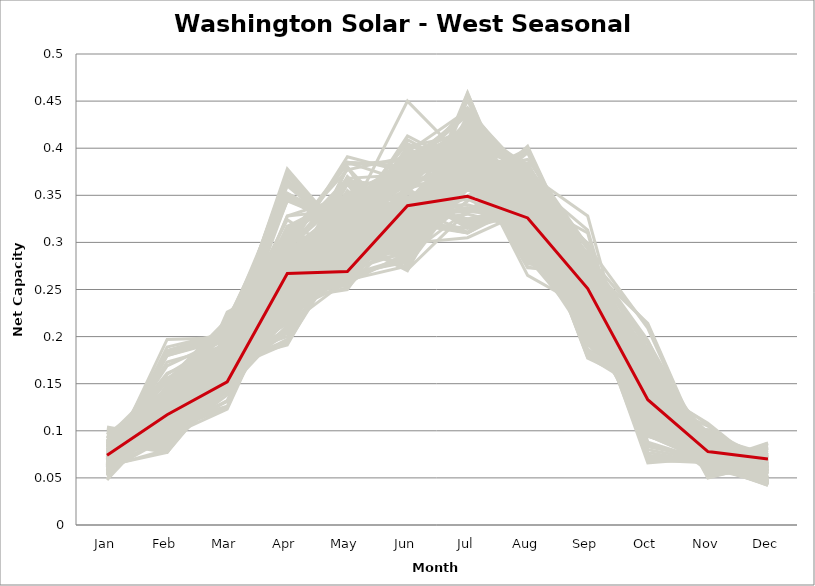
| Category | sample_001 | sample_002 | sample_003 | sample_004 | sample_005 | sample_006 | sample_007 | sample_008 | sample_009 | sample_010 | sample_011 | sample_012 | sample_013 | sample_014 | sample_015 | sample_016 | sample_017 | sample_018 | sample_019 | sample_020 | sample_021 | sample_022 | sample_023 | sample_024 | sample_025 | sample_026 | sample_027 | sample_028 | sample_029 | sample_030 | sample_031 | sample_032 | sample_033 | sample_034 | sample_035 | sample_036 | sample_037 | sample_038 | sample_039 | sample_040 | sample_041 | sample_042 | sample_043 | sample_044 | sample_045 | sample_046 | sample_047 | sample_048 | sample_049 | sample_050 | sample_051 | sample_052 | sample_053 | sample_054 | sample_055 | sample_056 | sample_057 | sample_058 | sample_059 | sample_060 | sample_061 | sample_062 | sample_063 | sample_064 | sample_065 | sample_066 | sample_067 | sample_068 | sample_069 | sample_070 | sample_071 | sample_072 | sample_073 | sample_074 | sample_075 | sample_076 | sample_077 | sample_078 | sample_079 | sample_080 | sample_081 | sample_082 | sample_083 | sample_084 | sample_085 | sample_086 | sample_087 | sample_088 | sample_089 | sample_090 | sample_091 | sample_092 | sample_093 | sample_094 | sample_095 | sample_096 | sample_097 | sample_098 | sample_099 | sample_100 | sample_101 | sample_102 | sample_103 | sample_104 | sample_105 | sample_106 | sample_107 | sample_108 | sample_109 | sample_110 | sample_111 | sample_112 | sample_113 | sample_114 | sample_115 | sample_116 | sample_117 | sample_118 | sample_119 | sample_120 | sample_121 | sample_122 | sample_123 | sample_124 | sample_125 | sample_126 | sample_127 | sample_128 | sample_129 | sample_130 | sample_131 | sample_132 | sample_133 | sample_134 | sample_135 | sample_136 | sample_137 | sample_138 | sample_139 | sample_140 | sample_141 | sample_142 | sample_143 | sample_144 | sample_145 | sample_146 | sample_147 | sample_148 | sample_149 | sample_150 | sample_151 | sample_152 | sample_153 | sample_154 | sample_155 | sample_156 | sample_157 | sample_158 | sample_159 | sample_160 | sample_161 | sample_162 | sample_163 | sample_164 | sample_165 | sample_166 | sample_167 | sample_168 | sample_169 | sample_170 | sample_171 | sample_172 | sample_173 | sample_174 | sample_175 | sample_176 | sample_178 | sample_179 | sample_180 | sample_181 | sample_182 | sample_183 | sample_184 | sample_185 | sample_186 | sample_187 | sample_188 | sample_189 | sample_190 | sample_191 | sample_192 | sample_193 | sample_194 | sample_195 | sample_196 | sample_197 | sample_198 | sample_199 | sample_200 | sample_201 | sample_202 | sample_203 | sample_204 | sample_205 | sample_206 | sample_207 | sample_208 | sample_209 | sample_210 | sample_211 | sample_212 | sample_213 | sample_214 | sample_215 | sample_216 | sample_217 | sample_218 | sample_219 | sample_220 | sample_221 | sample_222 | sample_223 | sample_224 | sample_225 | sample_226 | sample_227 | sample_228 | sample_229 | sample_230 | sample_231 | sample_232 | sample_233 | sample_234 | sample_235 | sample_236 | sample_237 | sample_238 | sample_239 | sample_240 | sample_241 | sample_242 | sample_243 | sample_244 | sample_245 | sample_246 | sample_247 | sample_248 | sample_249 | sample_250 | sample_177 |
|---|---|---|---|---|---|---|---|---|---|---|---|---|---|---|---|---|---|---|---|---|---|---|---|---|---|---|---|---|---|---|---|---|---|---|---|---|---|---|---|---|---|---|---|---|---|---|---|---|---|---|---|---|---|---|---|---|---|---|---|---|---|---|---|---|---|---|---|---|---|---|---|---|---|---|---|---|---|---|---|---|---|---|---|---|---|---|---|---|---|---|---|---|---|---|---|---|---|---|---|---|---|---|---|---|---|---|---|---|---|---|---|---|---|---|---|---|---|---|---|---|---|---|---|---|---|---|---|---|---|---|---|---|---|---|---|---|---|---|---|---|---|---|---|---|---|---|---|---|---|---|---|---|---|---|---|---|---|---|---|---|---|---|---|---|---|---|---|---|---|---|---|---|---|---|---|---|---|---|---|---|---|---|---|---|---|---|---|---|---|---|---|---|---|---|---|---|---|---|---|---|---|---|---|---|---|---|---|---|---|---|---|---|---|---|---|---|---|---|---|---|---|---|---|---|---|---|---|---|---|---|---|---|---|---|---|---|---|---|---|---|---|---|---|---|---|---|---|---|---|---|
| Jan | 0.084 | 0.064 | 0.059 | 0.086 | 0.084 | 0.075 | 0.063 | 0.098 | 0.076 | 0.084 | 0.057 | 0.064 | 0.085 | 0.058 | 0.091 | 0.075 | 0.087 | 0.092 | 0.091 | 0.055 | 0.06 | 0.066 | 0.075 | 0.074 | 0.074 | 0.07 | 0.071 | 0.074 | 0.076 | 0.054 | 0.066 | 0.064 | 0.073 | 0.074 | 0.067 | 0.062 | 0.068 | 0.08 | 0.075 | 0.104 | 0.073 | 0.077 | 0.086 | 0.063 | 0.053 | 0.064 | 0.092 | 0.102 | 0.087 | 0.07 | 0.068 | 0.064 | 0.083 | 0.084 | 0.072 | 0.099 | 0.098 | 0.054 | 0.074 | 0.061 | 0.082 | 0.07 | 0.067 | 0.049 | 0.085 | 0.069 | 0.079 | 0.063 | 0.072 | 0.084 | 0.076 | 0.084 | 0.072 | 0.086 | 0.067 | 0.055 | 0.089 | 0.075 | 0.076 | 0.065 | 0.082 | 0.074 | 0.083 | 0.1 | 0.083 | 0.076 | 0.09 | 0.086 | 0.077 | 0.065 | 0.072 | 0.064 | 0.07 | 0.065 | 0.081 | 0.048 | 0.086 | 0.092 | 0.087 | 0.064 | 0.083 | 0.061 | 0.053 | 0.062 | 0.073 | 0.068 | 0.062 | 0.068 | 0.067 | 0.099 | 0.078 | 0.089 | 0.095 | 0.103 | 0.087 | 0.065 | 0.061 | 0.07 | 0.063 | 0.068 | 0.054 | 0.065 | 0.061 | 0.065 | 0.069 | 0.068 | 0.079 | 0.065 | 0.076 | 0.077 | 0.094 | 0.088 | 0.063 | 0.081 | 0.076 | 0.057 | 0.063 | 0.062 | 0.071 | 0.08 | 0.067 | 0.075 | 0.071 | 0.098 | 0.082 | 0.072 | 0.075 | 0.075 | 0.057 | 0.069 | 0.074 | 0.061 | 0.055 | 0.074 | 0.083 | 0.06 | 0.083 | 0.077 | 0.072 | 0.073 | 0.07 | 0.102 | 0.084 | 0.08 | 0.08 | 0.075 | 0.083 | 0.074 | 0.078 | 0.085 | 0.089 | 0.063 | 0.061 | 0.073 | 0.068 | 0.093 | 0.056 | 0.064 | 0.067 | 0.068 | 0.071 | 0.067 | 0.07 | 0.084 | 0.07 | 0.075 | 0.089 | 0.073 | 0.087 | 0.086 | 0.087 | 0.052 | 0.063 | 0.073 | 0.068 | 0.065 | 0.068 | 0.069 | 0.083 | 0.07 | 0.083 | 0.082 | 0.072 | 0.062 | 0.075 | 0.073 | 0.082 | 0.079 | 0.079 | 0.088 | 0.068 | 0.09 | 0.064 | 0.075 | 0.078 | 0.068 | 0.082 | 0.07 | 0.085 | 0.057 | 0.08 | 0.069 | 0.073 | 0.08 | 0.082 | 0.068 | 0.08 | 0.083 | 0.087 | 0.058 | 0.088 | 0.085 | 0.048 | 0.067 | 0.084 | 0.072 | 0.083 | 0.069 | 0.093 | 0.101 | 0.071 | 0.064 | 0.066 | 0.096 | 0.064 | 0.08 | 0.071 | 0.067 | 0.053 | 0.074 |
| Feb | 0.125 | 0.133 | 0.137 | 0.122 | 0.116 | 0.113 | 0.114 | 0.093 | 0.086 | 0.113 | 0.118 | 0.112 | 0.114 | 0.149 | 0.087 | 0.134 | 0.077 | 0.139 | 0.09 | 0.127 | 0.112 | 0.114 | 0.14 | 0.104 | 0.107 | 0.147 | 0.11 | 0.109 | 0.14 | 0.125 | 0.106 | 0.104 | 0.114 | 0.112 | 0.13 | 0.11 | 0.122 | 0.132 | 0.138 | 0.092 | 0.122 | 0.109 | 0.12 | 0.185 | 0.133 | 0.111 | 0.082 | 0.086 | 0.146 | 0.111 | 0.113 | 0.109 | 0.098 | 0.109 | 0.173 | 0.086 | 0.081 | 0.115 | 0.104 | 0.093 | 0.156 | 0.184 | 0.116 | 0.125 | 0.081 | 0.116 | 0.095 | 0.182 | 0.185 | 0.112 | 0.117 | 0.1 | 0.117 | 0.155 | 0.109 | 0.126 | 0.136 | 0.111 | 0.089 | 0.102 | 0.093 | 0.105 | 0.126 | 0.084 | 0.101 | 0.103 | 0.128 | 0.121 | 0.098 | 0.121 | 0.105 | 0.113 | 0.123 | 0.123 | 0.107 | 0.116 | 0.09 | 0.144 | 0.119 | 0.121 | 0.103 | 0.116 | 0.134 | 0.119 | 0.105 | 0.108 | 0.121 | 0.128 | 0.125 | 0.088 | 0.095 | 0.091 | 0.094 | 0.085 | 0.133 | 0.108 | 0.102 | 0.108 | 0.11 | 0.112 | 0.127 | 0.134 | 0.189 | 0.125 | 0.119 | 0.125 | 0.121 | 0.117 | 0.124 | 0.107 | 0.086 | 0.143 | 0.108 | 0.099 | 0.117 | 0.093 | 0.119 | 0.08 | 0.099 | 0.118 | 0.131 | 0.134 | 0.122 | 0.078 | 0.117 | 0.112 | 0.123 | 0.1 | 0.144 | 0.101 | 0.132 | 0.119 | 0.142 | 0.16 | 0.097 | 0.121 | 0.123 | 0.116 | 0.121 | 0.126 | 0.18 | 0.093 | 0.117 | 0.122 | 0.102 | 0.132 | 0.105 | 0.136 | 0.123 | 0.091 | 0.153 | 0.118 | 0.105 | 0.11 | 0.092 | 0.156 | 0.129 | 0.11 | 0.118 | 0.122 | 0.108 | 0.127 | 0.103 | 0.132 | 0.108 | 0.112 | 0.129 | 0.126 | 0.103 | 0.082 | 0.08 | 0.117 | 0.077 | 0.169 | 0.123 | 0.181 | 0.128 | 0.098 | 0.117 | 0.102 | 0.161 | 0.103 | 0.111 | 0.197 | 0.122 | 0.1 | 0.143 | 0.094 | 0.09 | 0.129 | 0.13 | 0.086 | 0.111 | 0.117 | 0.153 | 0.099 | 0.152 | 0.116 | 0.088 | 0.146 | 0.133 | 0.185 | 0.127 | 0.129 | 0.117 | 0.109 | 0.112 | 0.112 | 0.088 | 0.131 | 0.128 | 0.134 | 0.129 | 0.102 | 0.08 | 0.117 | 0.115 | 0.104 | 0.089 | 0.087 | 0.109 | 0.18 | 0.119 | 0.144 | 0.119 | 0.095 | 0.115 | 0.128 | 0.126 | 0.117 |
| Mar | 0.17 | 0.216 | 0.198 | 0.189 | 0.174 | 0.155 | 0.175 | 0.152 | 0.144 | 0.165 | 0.185 | 0.182 | 0.183 | 0.217 | 0.15 | 0.195 | 0.153 | 0.196 | 0.146 | 0.172 | 0.189 | 0.174 | 0.189 | 0.131 | 0.126 | 0.195 | 0.16 | 0.141 | 0.184 | 0.191 | 0.179 | 0.176 | 0.197 | 0.174 | 0.217 | 0.182 | 0.189 | 0.183 | 0.211 | 0.188 | 0.153 | 0.143 | 0.182 | 0.205 | 0.194 | 0.171 | 0.143 | 0.174 | 0.161 | 0.197 | 0.177 | 0.178 | 0.175 | 0.171 | 0.191 | 0.175 | 0.18 | 0.173 | 0.142 | 0.161 | 0.193 | 0.2 | 0.187 | 0.153 | 0.226 | 0.163 | 0.165 | 0.206 | 0.202 | 0.175 | 0.18 | 0.222 | 0.147 | 0.158 | 0.182 | 0.191 | 0.154 | 0.144 | 0.151 | 0.174 | 0.132 | 0.149 | 0.194 | 0.153 | 0.173 | 0.143 | 0.153 | 0.19 | 0.173 | 0.163 | 0.155 | 0.184 | 0.187 | 0.187 | 0.164 | 0.16 | 0.138 | 0.153 | 0.172 | 0.197 | 0.174 | 0.173 | 0.189 | 0.161 | 0.158 | 0.156 | 0.16 | 0.214 | 0.191 | 0.174 | 0.2 | 0.149 | 0.175 | 0.159 | 0.192 | 0.186 | 0.159 | 0.151 | 0.156 | 0.172 | 0.194 | 0.198 | 0.204 | 0.214 | 0.189 | 0.19 | 0.145 | 0.192 | 0.175 | 0.183 | 0.15 | 0.151 | 0.159 | 0.125 | 0.155 | 0.148 | 0.174 | 0.155 | 0.18 | 0.185 | 0.212 | 0.209 | 0.149 | 0.154 | 0.18 | 0.178 | 0.156 | 0.18 | 0.208 | 0.178 | 0.191 | 0.175 | 0.195 | 0.199 | 0.132 | 0.169 | 0.192 | 0.142 | 0.153 | 0.151 | 0.197 | 0.186 | 0.176 | 0.172 | 0.168 | 0.186 | 0.171 | 0.19 | 0.182 | 0.148 | 0.155 | 0.191 | 0.185 | 0.171 | 0.18 | 0.165 | 0.19 | 0.185 | 0.193 | 0.186 | 0.177 | 0.214 | 0.168 | 0.19 | 0.151 | 0.175 | 0.192 | 0.152 | 0.178 | 0.144 | 0.166 | 0.172 | 0.163 | 0.199 | 0.186 | 0.198 | 0.194 | 0.173 | 0.175 | 0.172 | 0.189 | 0.165 | 0.153 | 0.199 | 0.14 | 0.178 | 0.19 | 0.123 | 0.15 | 0.191 | 0.211 | 0.183 | 0.189 | 0.148 | 0.218 | 0.169 | 0.19 | 0.175 | 0.2 | 0.211 | 0.174 | 0.194 | 0.145 | 0.167 | 0.154 | 0.162 | 0.151 | 0.179 | 0.192 | 0.158 | 0.163 | 0.157 | 0.158 | 0.152 | 0.149 | 0.153 | 0.172 | 0.172 | 0.161 | 0.159 | 0.176 | 0.199 | 0.154 | 0.166 | 0.162 | 0.142 | 0.148 | 0.21 | 0.193 | 0.152 |
| Apr | 0.283 | 0.352 | 0.272 | 0.3 | 0.245 | 0.264 | 0.224 | 0.254 | 0.212 | 0.197 | 0.246 | 0.225 | 0.317 | 0.282 | 0.262 | 0.232 | 0.248 | 0.29 | 0.252 | 0.251 | 0.348 | 0.214 | 0.245 | 0.258 | 0.258 | 0.269 | 0.232 | 0.227 | 0.234 | 0.251 | 0.328 | 0.233 | 0.245 | 0.289 | 0.345 | 0.226 | 0.226 | 0.235 | 0.236 | 0.243 | 0.227 | 0.246 | 0.306 | 0.309 | 0.276 | 0.215 | 0.255 | 0.246 | 0.231 | 0.374 | 0.215 | 0.218 | 0.236 | 0.238 | 0.296 | 0.25 | 0.25 | 0.24 | 0.238 | 0.227 | 0.27 | 0.285 | 0.216 | 0.228 | 0.259 | 0.257 | 0.193 | 0.314 | 0.284 | 0.233 | 0.298 | 0.303 | 0.228 | 0.231 | 0.37 | 0.266 | 0.223 | 0.252 | 0.228 | 0.314 | 0.255 | 0.234 | 0.292 | 0.256 | 0.244 | 0.241 | 0.211 | 0.294 | 0.283 | 0.246 | 0.221 | 0.223 | 0.238 | 0.222 | 0.245 | 0.237 | 0.239 | 0.236 | 0.252 | 0.373 | 0.191 | 0.251 | 0.258 | 0.24 | 0.222 | 0.22 | 0.204 | 0.352 | 0.241 | 0.247 | 0.243 | 0.256 | 0.253 | 0.252 | 0.303 | 0.347 | 0.226 | 0.22 | 0.237 | 0.262 | 0.25 | 0.36 | 0.31 | 0.346 | 0.23 | 0.23 | 0.259 | 0.378 | 0.293 | 0.283 | 0.256 | 0.228 | 0.26 | 0.265 | 0.235 | 0.277 | 0.215 | 0.217 | 0.299 | 0.283 | 0.345 | 0.235 | 0.232 | 0.249 | 0.312 | 0.236 | 0.247 | 0.266 | 0.281 | 0.2 | 0.234 | 0.229 | 0.289 | 0.261 | 0.239 | 0.259 | 0.293 | 0.244 | 0.249 | 0.282 | 0.286 | 0.239 | 0.317 | 0.243 | 0.245 | 0.239 | 0.246 | 0.226 | 0.227 | 0.238 | 0.231 | 0.366 | 0.348 | 0.24 | 0.291 | 0.247 | 0.278 | 0.363 | 0.374 | 0.223 | 0.351 | 0.349 | 0.261 | 0.285 | 0.228 | 0.247 | 0.302 | 0.239 | 0.238 | 0.244 | 0.251 | 0.251 | 0.206 | 0.298 | 0.215 | 0.294 | 0.236 | 0.195 | 0.27 | 0.345 | 0.266 | 0.243 | 0.265 | 0.324 | 0.252 | 0.272 | 0.297 | 0.262 | 0.226 | 0.307 | 0.363 | 0.246 | 0.344 | 0.234 | 0.241 | 0.23 | 0.269 | 0.207 | 0.236 | 0.281 | 0.24 | 0.285 | 0.23 | 0.241 | 0.248 | 0.26 | 0.264 | 0.247 | 0.244 | 0.255 | 0.209 | 0.221 | 0.239 | 0.22 | 0.247 | 0.231 | 0.236 | 0.328 | 0.264 | 0.255 | 0.274 | 0.305 | 0.241 | 0.251 | 0.206 | 0.244 | 0.23 | 0.346 | 0.251 | 0.267 |
| May | 0.267 | 0.316 | 0.317 | 0.368 | 0.257 | 0.276 | 0.283 | 0.37 | 0.26 | 0.302 | 0.333 | 0.282 | 0.349 | 0.314 | 0.35 | 0.294 | 0.316 | 0.391 | 0.347 | 0.321 | 0.307 | 0.295 | 0.297 | 0.326 | 0.328 | 0.297 | 0.281 | 0.263 | 0.293 | 0.328 | 0.349 | 0.333 | 0.299 | 0.341 | 0.318 | 0.287 | 0.297 | 0.305 | 0.288 | 0.365 | 0.278 | 0.277 | 0.364 | 0.295 | 0.313 | 0.297 | 0.347 | 0.38 | 0.297 | 0.298 | 0.292 | 0.294 | 0.329 | 0.26 | 0.29 | 0.366 | 0.38 | 0.334 | 0.27 | 0.305 | 0.322 | 0.297 | 0.288 | 0.351 | 0.283 | 0.336 | 0.294 | 0.285 | 0.295 | 0.263 | 0.352 | 0.258 | 0.284 | 0.315 | 0.302 | 0.331 | 0.283 | 0.269 | 0.267 | 0.345 | 0.324 | 0.278 | 0.366 | 0.366 | 0.33 | 0.265 | 0.299 | 0.385 | 0.326 | 0.331 | 0.282 | 0.282 | 0.29 | 0.295 | 0.258 | 0.34 | 0.339 | 0.322 | 0.254 | 0.294 | 0.303 | 0.319 | 0.322 | 0.327 | 0.27 | 0.269 | 0.312 | 0.319 | 0.319 | 0.364 | 0.299 | 0.355 | 0.362 | 0.379 | 0.383 | 0.326 | 0.313 | 0.275 | 0.332 | 0.334 | 0.328 | 0.307 | 0.28 | 0.314 | 0.292 | 0.3 | 0.279 | 0.304 | 0.35 | 0.335 | 0.342 | 0.301 | 0.327 | 0.323 | 0.279 | 0.312 | 0.291 | 0.33 | 0.35 | 0.337 | 0.322 | 0.285 | 0.278 | 0.362 | 0.344 | 0.336 | 0.275 | 0.341 | 0.297 | 0.302 | 0.304 | 0.284 | 0.316 | 0.3 | 0.329 | 0.32 | 0.324 | 0.279 | 0.281 | 0.291 | 0.294 | 0.367 | 0.339 | 0.259 | 0.339 | 0.307 | 0.341 | 0.308 | 0.308 | 0.343 | 0.314 | 0.302 | 0.312 | 0.336 | 0.338 | 0.324 | 0.316 | 0.302 | 0.306 | 0.296 | 0.321 | 0.324 | 0.338 | 0.337 | 0.27 | 0.334 | 0.385 | 0.284 | 0.329 | 0.327 | 0.307 | 0.328 | 0.324 | 0.291 | 0.29 | 0.287 | 0.293 | 0.302 | 0.305 | 0.326 | 0.321 | 0.336 | 0.28 | 0.281 | 0.276 | 0.336 | 0.385 | 0.323 | 0.257 | 0.377 | 0.318 | 0.303 | 0.318 | 0.274 | 0.292 | 0.328 | 0.332 | 0.306 | 0.296 | 0.316 | 0.25 | 0.29 | 0.283 | 0.255 | 0.272 | 0.328 | 0.268 | 0.262 | 0.302 | 0.313 | 0.305 | 0.292 | 0.348 | 0.267 | 0.312 | 0.275 | 0.252 | 0.335 | 0.369 | 0.368 | 0.332 | 0.283 | 0.34 | 0.332 | 0.311 | 0.342 | 0.266 | 0.316 | 0.329 | 0.269 |
| Jun | 0.34 | 0.391 | 0.396 | 0.372 | 0.329 | 0.321 | 0.307 | 0.306 | 0.275 | 0.372 | 0.362 | 0.294 | 0.373 | 0.401 | 0.29 | 0.314 | 0.297 | 0.374 | 0.303 | 0.367 | 0.37 | 0.296 | 0.337 | 0.309 | 0.321 | 0.285 | 0.357 | 0.282 | 0.329 | 0.387 | 0.332 | 0.277 | 0.335 | 0.391 | 0.382 | 0.299 | 0.327 | 0.328 | 0.312 | 0.338 | 0.354 | 0.309 | 0.361 | 0.299 | 0.394 | 0.308 | 0.292 | 0.311 | 0.396 | 0.393 | 0.29 | 0.319 | 0.291 | 0.319 | 0.278 | 0.314 | 0.285 | 0.308 | 0.29 | 0.271 | 0.361 | 0.305 | 0.321 | 0.299 | 0.33 | 0.387 | 0.36 | 0.299 | 0.293 | 0.327 | 0.381 | 0.364 | 0.352 | 0.375 | 0.376 | 0.384 | 0.38 | 0.307 | 0.279 | 0.332 | 0.317 | 0.299 | 0.357 | 0.299 | 0.292 | 0.284 | 0.376 | 0.364 | 0.37 | 0.284 | 0.322 | 0.3 | 0.318 | 0.322 | 0.325 | 0.298 | 0.306 | 0.375 | 0.337 | 0.395 | 0.375 | 0.39 | 0.388 | 0.278 | 0.32 | 0.348 | 0.288 | 0.391 | 0.327 | 0.29 | 0.292 | 0.299 | 0.318 | 0.306 | 0.387 | 0.375 | 0.286 | 0.338 | 0.275 | 0.391 | 0.395 | 0.393 | 0.287 | 0.393 | 0.31 | 0.317 | 0.325 | 0.395 | 0.384 | 0.37 | 0.289 | 0.382 | 0.372 | 0.303 | 0.354 | 0.386 | 0.318 | 0.405 | 0.333 | 0.344 | 0.387 | 0.295 | 0.335 | 0.279 | 0.383 | 0.363 | 0.321 | 0.379 | 0.398 | 0.273 | 0.318 | 0.309 | 0.409 | 0.3 | 0.308 | 0.387 | 0.45 | 0.313 | 0.341 | 0.347 | 0.292 | 0.33 | 0.383 | 0.339 | 0.29 | 0.33 | 0.28 | 0.321 | 0.31 | 0.296 | 0.384 | 0.402 | 0.365 | 0.295 | 0.331 | 0.387 | 0.413 | 0.375 | 0.392 | 0.325 | 0.343 | 0.392 | 0.387 | 0.368 | 0.338 | 0.29 | 0.381 | 0.344 | 0.306 | 0.301 | 0.31 | 0.353 | 0.382 | 0.29 | 0.319 | 0.304 | 0.317 | 0.27 | 0.377 | 0.356 | 0.348 | 0.281 | 0.335 | 0.315 | 0.318 | 0.37 | 0.38 | 0.294 | 0.289 | 0.391 | 0.391 | 0.3 | 0.377 | 0.331 | 0.29 | 0.279 | 0.343 | 0.284 | 0.31 | 0.389 | 0.341 | 0.299 | 0.328 | 0.337 | 0.335 | 0.395 | 0.338 | 0.335 | 0.304 | 0.381 | 0.38 | 0.373 | 0.317 | 0.323 | 0.293 | 0.33 | 0.318 | 0.336 | 0.305 | 0.3 | 0.393 | 0.291 | 0.282 | 0.38 | 0.292 | 0.321 | 0.299 | 0.375 | 0.383 | 0.339 |
| Jul | 0.359 | 0.393 | 0.38 | 0.381 | 0.384 | 0.33 | 0.411 | 0.375 | 0.415 | 0.424 | 0.379 | 0.394 | 0.401 | 0.398 | 0.368 | 0.418 | 0.426 | 0.391 | 0.388 | 0.4 | 0.412 | 0.41 | 0.421 | 0.367 | 0.366 | 0.367 | 0.32 | 0.4 | 0.408 | 0.373 | 0.411 | 0.36 | 0.38 | 0.413 | 0.405 | 0.394 | 0.411 | 0.414 | 0.349 | 0.373 | 0.315 | 0.391 | 0.39 | 0.424 | 0.373 | 0.416 | 0.382 | 0.382 | 0.44 | 0.413 | 0.403 | 0.41 | 0.381 | 0.367 | 0.408 | 0.377 | 0.381 | 0.414 | 0.399 | 0.333 | 0.365 | 0.398 | 0.406 | 0.424 | 0.428 | 0.392 | 0.429 | 0.425 | 0.398 | 0.369 | 0.407 | 0.42 | 0.321 | 0.44 | 0.405 | 0.376 | 0.44 | 0.372 | 0.418 | 0.406 | 0.361 | 0.412 | 0.375 | 0.381 | 0.384 | 0.407 | 0.425 | 0.382 | 0.405 | 0.378 | 0.315 | 0.409 | 0.407 | 0.418 | 0.36 | 0.416 | 0.375 | 0.442 | 0.39 | 0.407 | 0.422 | 0.406 | 0.393 | 0.365 | 0.31 | 0.318 | 0.4 | 0.399 | 0.389 | 0.374 | 0.458 | 0.375 | 0.368 | 0.387 | 0.384 | 0.412 | 0.334 | 0.311 | 0.36 | 0.402 | 0.379 | 0.421 | 0.423 | 0.403 | 0.399 | 0.422 | 0.381 | 0.408 | 0.412 | 0.405 | 0.372 | 0.437 | 0.406 | 0.369 | 0.316 | 0.402 | 0.407 | 0.375 | 0.399 | 0.4 | 0.406 | 0.344 | 0.325 | 0.376 | 0.396 | 0.359 | 0.337 | 0.409 | 0.38 | 0.384 | 0.42 | 0.415 | 0.375 | 0.362 | 0.365 | 0.405 | 0.385 | 0.391 | 0.333 | 0.323 | 0.407 | 0.365 | 0.392 | 0.382 | 0.387 | 0.418 | 0.386 | 0.421 | 0.415 | 0.365 | 0.438 | 0.415 | 0.411 | 0.38 | 0.392 | 0.435 | 0.38 | 0.407 | 0.414 | 0.417 | 0.413 | 0.398 | 0.393 | 0.396 | 0.325 | 0.383 | 0.386 | 0.336 | 0.387 | 0.413 | 0.43 | 0.412 | 0.389 | 0.408 | 0.418 | 0.408 | 0.421 | 0.388 | 0.399 | 0.424 | 0.361 | 0.39 | 0.346 | 0.427 | 0.379 | 0.41 | 0.389 | 0.356 | 0.415 | 0.395 | 0.412 | 0.451 | 0.414 | 0.334 | 0.344 | 0.363 | 0.376 | 0.4 | 0.435 | 0.396 | 0.4 | 0.395 | 0.333 | 0.382 | 0.368 | 0.391 | 0.34 | 0.382 | 0.459 | 0.387 | 0.425 | 0.443 | 0.425 | 0.31 | 0.414 | 0.31 | 0.377 | 0.421 | 0.384 | 0.389 | 0.405 | 0.425 | 0.375 | 0.435 | 0.393 | 0.37 | 0.305 | 0.397 | 0.374 | 0.349 |
| Aug | 0.342 | 0.293 | 0.37 | 0.286 | 0.282 | 0.314 | 0.348 | 0.326 | 0.295 | 0.37 | 0.382 | 0.343 | 0.296 | 0.362 | 0.333 | 0.345 | 0.345 | 0.277 | 0.339 | 0.384 | 0.319 | 0.355 | 0.333 | 0.33 | 0.34 | 0.399 | 0.35 | 0.282 | 0.322 | 0.377 | 0.354 | 0.361 | 0.314 | 0.329 | 0.293 | 0.35 | 0.349 | 0.33 | 0.4 | 0.284 | 0.348 | 0.284 | 0.274 | 0.327 | 0.38 | 0.352 | 0.328 | 0.303 | 0.372 | 0.294 | 0.354 | 0.35 | 0.336 | 0.286 | 0.334 | 0.285 | 0.291 | 0.376 | 0.299 | 0.367 | 0.324 | 0.357 | 0.343 | 0.377 | 0.325 | 0.343 | 0.378 | 0.319 | 0.357 | 0.289 | 0.32 | 0.29 | 0.352 | 0.357 | 0.303 | 0.374 | 0.363 | 0.281 | 0.301 | 0.363 | 0.326 | 0.309 | 0.289 | 0.314 | 0.343 | 0.289 | 0.362 | 0.273 | 0.32 | 0.344 | 0.332 | 0.345 | 0.333 | 0.35 | 0.29 | 0.378 | 0.326 | 0.362 | 0.265 | 0.303 | 0.376 | 0.364 | 0.379 | 0.351 | 0.346 | 0.35 | 0.369 | 0.286 | 0.327 | 0.288 | 0.312 | 0.341 | 0.292 | 0.309 | 0.286 | 0.333 | 0.373 | 0.353 | 0.345 | 0.332 | 0.382 | 0.291 | 0.321 | 0.298 | 0.341 | 0.347 | 0.299 | 0.322 | 0.32 | 0.308 | 0.323 | 0.358 | 0.349 | 0.332 | 0.351 | 0.38 | 0.351 | 0.388 | 0.373 | 0.299 | 0.295 | 0.402 | 0.339 | 0.312 | 0.307 | 0.383 | 0.323 | 0.332 | 0.36 | 0.363 | 0.341 | 0.353 | 0.371 | 0.396 | 0.32 | 0.363 | 0.373 | 0.286 | 0.326 | 0.332 | 0.361 | 0.291 | 0.292 | 0.295 | 0.348 | 0.33 | 0.344 | 0.338 | 0.342 | 0.33 | 0.366 | 0.302 | 0.321 | 0.326 | 0.381 | 0.362 | 0.37 | 0.314 | 0.313 | 0.353 | 0.335 | 0.291 | 0.329 | 0.319 | 0.337 | 0.349 | 0.288 | 0.343 | 0.342 | 0.358 | 0.334 | 0.379 | 0.379 | 0.34 | 0.353 | 0.324 | 0.345 | 0.36 | 0.341 | 0.343 | 0.305 | 0.35 | 0.317 | 0.325 | 0.288 | 0.334 | 0.298 | 0.327 | 0.297 | 0.293 | 0.294 | 0.309 | 0.326 | 0.337 | 0.395 | 0.364 | 0.315 | 0.348 | 0.303 | 0.361 | 0.281 | 0.364 | 0.341 | 0.291 | 0.297 | 0.331 | 0.322 | 0.298 | 0.303 | 0.374 | 0.363 | 0.366 | 0.381 | 0.345 | 0.348 | 0.342 | 0.28 | 0.351 | 0.323 | 0.306 | 0.325 | 0.327 | 0.349 | 0.367 | 0.364 | 0.325 | 0.334 | 0.286 | 0.377 | 0.326 |
| Sep | 0.239 | 0.214 | 0.247 | 0.266 | 0.237 | 0.219 | 0.191 | 0.23 | 0.274 | 0.288 | 0.286 | 0.192 | 0.258 | 0.247 | 0.242 | 0.177 | 0.229 | 0.273 | 0.234 | 0.265 | 0.212 | 0.202 | 0.187 | 0.274 | 0.28 | 0.268 | 0.253 | 0.267 | 0.198 | 0.271 | 0.201 | 0.299 | 0.252 | 0.282 | 0.219 | 0.194 | 0.193 | 0.193 | 0.265 | 0.208 | 0.251 | 0.27 | 0.262 | 0.228 | 0.263 | 0.203 | 0.238 | 0.219 | 0.244 | 0.198 | 0.21 | 0.197 | 0.251 | 0.242 | 0.246 | 0.226 | 0.226 | 0.285 | 0.264 | 0.313 | 0.217 | 0.258 | 0.209 | 0.275 | 0.196 | 0.273 | 0.285 | 0.236 | 0.255 | 0.247 | 0.269 | 0.212 | 0.254 | 0.225 | 0.198 | 0.271 | 0.257 | 0.273 | 0.27 | 0.206 | 0.268 | 0.269 | 0.271 | 0.23 | 0.245 | 0.257 | 0.267 | 0.269 | 0.284 | 0.276 | 0.272 | 0.202 | 0.194 | 0.205 | 0.259 | 0.285 | 0.255 | 0.236 | 0.229 | 0.206 | 0.283 | 0.255 | 0.283 | 0.299 | 0.26 | 0.267 | 0.214 | 0.221 | 0.238 | 0.216 | 0.229 | 0.242 | 0.219 | 0.223 | 0.263 | 0.199 | 0.328 | 0.259 | 0.31 | 0.281 | 0.276 | 0.217 | 0.233 | 0.219 | 0.208 | 0.178 | 0.272 | 0.207 | 0.266 | 0.276 | 0.236 | 0.272 | 0.264 | 0.267 | 0.253 | 0.269 | 0.209 | 0.296 | 0.193 | 0.277 | 0.211 | 0.265 | 0.255 | 0.228 | 0.262 | 0.278 | 0.246 | 0.281 | 0.25 | 0.227 | 0.181 | 0.197 | 0.267 | 0.264 | 0.269 | 0.262 | 0.211 | 0.277 | 0.25 | 0.204 | 0.251 | 0.206 | 0.269 | 0.25 | 0.262 | 0.198 | 0.266 | 0.184 | 0.179 | 0.248 | 0.232 | 0.208 | 0.212 | 0.266 | 0.199 | 0.222 | 0.254 | 0.199 | 0.192 | 0.2 | 0.207 | 0.217 | 0.267 | 0.243 | 0.282 | 0.265 | 0.254 | 0.252 | 0.238 | 0.246 | 0.221 | 0.28 | 0.293 | 0.248 | 0.205 | 0.25 | 0.184 | 0.227 | 0.229 | 0.207 | 0.221 | 0.256 | 0.228 | 0.212 | 0.278 | 0.289 | 0.268 | 0.269 | 0.274 | 0.261 | 0.215 | 0.23 | 0.206 | 0.257 | 0.264 | 0.298 | 0.212 | 0.215 | 0.222 | 0.236 | 0.232 | 0.256 | 0.25 | 0.244 | 0.27 | 0.283 | 0.249 | 0.256 | 0.226 | 0.245 | 0.281 | 0.261 | 0.296 | 0.264 | 0.237 | 0.247 | 0.238 | 0.198 | 0.224 | 0.222 | 0.281 | 0.231 | 0.296 | 0.209 | 0.213 | 0.258 | 0.241 | 0.216 | 0.266 | 0.251 |
| Oct | 0.141 | 0.095 | 0.15 | 0.117 | 0.128 | 0.122 | 0.183 | 0.116 | 0.153 | 0.134 | 0.17 | 0.168 | 0.138 | 0.143 | 0.113 | 0.147 | 0.162 | 0.105 | 0.119 | 0.185 | 0.133 | 0.179 | 0.137 | 0.118 | 0.119 | 0.126 | 0.15 | 0.164 | 0.136 | 0.174 | 0.139 | 0.088 | 0.149 | 0.155 | 0.101 | 0.165 | 0.158 | 0.137 | 0.141 | 0.12 | 0.146 | 0.147 | 0.126 | 0.095 | 0.155 | 0.182 | 0.113 | 0.127 | 0.116 | 0.115 | 0.181 | 0.178 | 0.069 | 0.137 | 0.108 | 0.119 | 0.117 | 0.196 | 0.156 | 0.095 | 0.112 | 0.121 | 0.168 | 0.214 | 0.152 | 0.183 | 0.148 | 0.102 | 0.114 | 0.131 | 0.146 | 0.129 | 0.142 | 0.111 | 0.127 | 0.164 | 0.112 | 0.141 | 0.151 | 0.146 | 0.115 | 0.159 | 0.107 | 0.126 | 0.066 | 0.156 | 0.113 | 0.107 | 0.159 | 0.083 | 0.144 | 0.172 | 0.151 | 0.155 | 0.133 | 0.212 | 0.116 | 0.115 | 0.125 | 0.119 | 0.147 | 0.167 | 0.17 | 0.085 | 0.143 | 0.151 | 0.187 | 0.101 | 0.141 | 0.116 | 0.162 | 0.114 | 0.127 | 0.123 | 0.111 | 0.138 | 0.096 | 0.151 | 0.086 | 0.172 | 0.175 | 0.111 | 0.096 | 0.097 | 0.149 | 0.152 | 0.137 | 0.133 | 0.144 | 0.138 | 0.11 | 0.113 | 0.16 | 0.115 | 0.144 | 0.156 | 0.176 | 0.16 | 0.155 | 0.14 | 0.108 | 0.136 | 0.146 | 0.122 | 0.145 | 0.126 | 0.124 | 0.168 | 0.129 | 0.187 | 0.148 | 0.174 | 0.15 | 0.122 | 0.114 | 0.158 | 0.16 | 0.154 | 0.13 | 0.135 | 0.123 | 0.12 | 0.142 | 0.14 | 0.071 | 0.141 | 0.069 | 0.149 | 0.14 | 0.107 | 0.116 | 0.125 | 0.134 | 0.074 | 0.158 | 0.12 | 0.156 | 0.133 | 0.126 | 0.156 | 0.136 | 0.105 | 0.181 | 0.1 | 0.156 | 0.077 | 0.115 | 0.138 | 0.071 | 0.16 | 0.156 | 0.192 | 0.176 | 0.11 | 0.155 | 0.094 | 0.154 | 0.184 | 0.125 | 0.142 | 0.104 | 0.069 | 0.129 | 0.098 | 0.153 | 0.165 | 0.114 | 0.121 | 0.162 | 0.124 | 0.106 | 0.148 | 0.137 | 0.131 | 0.135 | 0.1 | 0.114 | 0.172 | 0.159 | 0.121 | 0.141 | 0.126 | 0.14 | 0.136 | 0.136 | 0.187 | 0.13 | 0.127 | 0.153 | 0.163 | 0.114 | 0.115 | 0.209 | 0.144 | 0.165 | 0.144 | 0.128 | 0.144 | 0.124 | 0.125 | 0.164 | 0.101 | 0.08 | 0.124 | 0.195 | 0.123 | 0.132 | 0.099 | 0.168 | 0.133 |
| Nov | 0.08 | 0.068 | 0.055 | 0.064 | 0.066 | 0.073 | 0.075 | 0.079 | 0.08 | 0.105 | 0.057 | 0.072 | 0.06 | 0.059 | 0.084 | 0.069 | 0.095 | 0.073 | 0.086 | 0.065 | 0.088 | 0.077 | 0.07 | 0.089 | 0.094 | 0.077 | 0.081 | 0.065 | 0.07 | 0.054 | 0.086 | 0.068 | 0.07 | 0.064 | 0.075 | 0.07 | 0.068 | 0.073 | 0.084 | 0.067 | 0.086 | 0.065 | 0.064 | 0.071 | 0.053 | 0.077 | 0.083 | 0.079 | 0.091 | 0.08 | 0.078 | 0.077 | 0.067 | 0.067 | 0.082 | 0.064 | 0.073 | 0.066 | 0.066 | 0.067 | 0.065 | 0.077 | 0.074 | 0.069 | 0.078 | 0.067 | 0.107 | 0.079 | 0.074 | 0.065 | 0.066 | 0.081 | 0.081 | 0.082 | 0.078 | 0.051 | 0.095 | 0.064 | 0.083 | 0.089 | 0.085 | 0.076 | 0.069 | 0.08 | 0.071 | 0.068 | 0.095 | 0.067 | 0.064 | 0.07 | 0.094 | 0.073 | 0.064 | 0.074 | 0.069 | 0.068 | 0.09 | 0.085 | 0.063 | 0.08 | 0.108 | 0.07 | 0.066 | 0.069 | 0.086 | 0.087 | 0.082 | 0.074 | 0.069 | 0.07 | 0.074 | 0.084 | 0.069 | 0.078 | 0.072 | 0.081 | 0.069 | 0.09 | 0.066 | 0.067 | 0.054 | 0.081 | 0.072 | 0.069 | 0.075 | 0.069 | 0.062 | 0.078 | 0.066 | 0.064 | 0.082 | 0.095 | 0.072 | 0.093 | 0.082 | 0.085 | 0.077 | 0.098 | 0.092 | 0.06 | 0.075 | 0.082 | 0.083 | 0.074 | 0.062 | 0.096 | 0.078 | 0.066 | 0.056 | 0.078 | 0.073 | 0.073 | 0.055 | 0.076 | 0.084 | 0.069 | 0.082 | 0.062 | 0.077 | 0.074 | 0.074 | 0.068 | 0.061 | 0.065 | 0.071 | 0.067 | 0.066 | 0.069 | 0.073 | 0.082 | 0.092 | 0.082 | 0.083 | 0.067 | 0.091 | 0.078 | 0.055 | 0.079 | 0.08 | 0.075 | 0.08 | 0.075 | 0.067 | 0.101 | 0.09 | 0.066 | 0.071 | 0.083 | 0.069 | 0.09 | 0.092 | 0.069 | 0.094 | 0.074 | 0.072 | 0.077 | 0.068 | 0.079 | 0.094 | 0.081 | 0.058 | 0.07 | 0.075 | 0.072 | 0.062 | 0.069 | 0.068 | 0.091 | 0.084 | 0.066 | 0.079 | 0.083 | 0.091 | 0.083 | 0.076 | 0.07 | 0.065 | 0.077 | 0.081 | 0.059 | 0.067 | 0.07 | 0.085 | 0.061 | 0.065 | 0.068 | 0.08 | 0.069 | 0.08 | 0.072 | 0.101 | 0.097 | 0.067 | 0.084 | 0.092 | 0.078 | 0.066 | 0.091 | 0.078 | 0.078 | 0.064 | 0.073 | 0.068 | 0.075 | 0.083 | 0.089 | 0.077 | 0.071 | 0.05 | 0.078 |
| Dec | 0.065 | 0.077 | 0.061 | 0.074 | 0.042 | 0.067 | 0.062 | 0.045 | 0.051 | 0.054 | 0.062 | 0.065 | 0.081 | 0.06 | 0.044 | 0.072 | 0.073 | 0.067 | 0.044 | 0.064 | 0.057 | 0.06 | 0.07 | 0.045 | 0.05 | 0.066 | 0.072 | 0.05 | 0.069 | 0.063 | 0.058 | 0.044 | 0.056 | 0.082 | 0.075 | 0.065 | 0.074 | 0.068 | 0.069 | 0.045 | 0.068 | 0.049 | 0.074 | 0.065 | 0.059 | 0.062 | 0.043 | 0.046 | 0.061 | 0.06 | 0.061 | 0.062 | 0.058 | 0.045 | 0.064 | 0.042 | 0.044 | 0.059 | 0.05 | 0.046 | 0.068 | 0.062 | 0.071 | 0.06 | 0.067 | 0.074 | 0.054 | 0.064 | 0.066 | 0.048 | 0.083 | 0.062 | 0.067 | 0.058 | 0.058 | 0.065 | 0.061 | 0.051 | 0.052 | 0.058 | 0.045 | 0.05 | 0.069 | 0.043 | 0.057 | 0.05 | 0.06 | 0.067 | 0.086 | 0.05 | 0.075 | 0.067 | 0.077 | 0.071 | 0.047 | 0.06 | 0.046 | 0.057 | 0.043 | 0.06 | 0.057 | 0.059 | 0.063 | 0.048 | 0.074 | 0.073 | 0.061 | 0.075 | 0.063 | 0.044 | 0.067 | 0.046 | 0.044 | 0.046 | 0.067 | 0.062 | 0.047 | 0.072 | 0.046 | 0.075 | 0.068 | 0.065 | 0.063 | 0.076 | 0.073 | 0.07 | 0.046 | 0.063 | 0.087 | 0.083 | 0.045 | 0.063 | 0.057 | 0.05 | 0.069 | 0.061 | 0.061 | 0.065 | 0.058 | 0.087 | 0.071 | 0.068 | 0.069 | 0.043 | 0.079 | 0.065 | 0.07 | 0.082 | 0.057 | 0.064 | 0.068 | 0.065 | 0.058 | 0.066 | 0.047 | 0.056 | 0.056 | 0.045 | 0.071 | 0.06 | 0.063 | 0.045 | 0.079 | 0.044 | 0.059 | 0.066 | 0.057 | 0.068 | 0.068 | 0.047 | 0.057 | 0.062 | 0.056 | 0.055 | 0.055 | 0.062 | 0.059 | 0.056 | 0.058 | 0.073 | 0.06 | 0.071 | 0.075 | 0.068 | 0.075 | 0.055 | 0.07 | 0.07 | 0.054 | 0.072 | 0.074 | 0.057 | 0.071 | 0.063 | 0.071 | 0.066 | 0.069 | 0.064 | 0.072 | 0.059 | 0.067 | 0.058 | 0.067 | 0.062 | 0.048 | 0.084 | 0.07 | 0.047 | 0.055 | 0.074 | 0.071 | 0.068 | 0.055 | 0.071 | 0.073 | 0.044 | 0.07 | 0.062 | 0.065 | 0.056 | 0.043 | 0.061 | 0.068 | 0.044 | 0.048 | 0.074 | 0.07 | 0.047 | 0.065 | 0.058 | 0.064 | 0.059 | 0.059 | 0.074 | 0.072 | 0.071 | 0.043 | 0.055 | 0.045 | 0.043 | 0.081 | 0.064 | 0.05 | 0.06 | 0.061 | 0.046 | 0.066 | 0.073 | 0.066 | 0.07 |